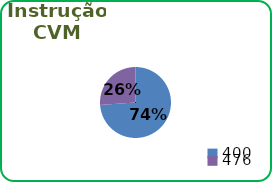
| Category | Instrução CVM |
|---|---|
| 400.0 | 34 |
| 476.0 | 12 |